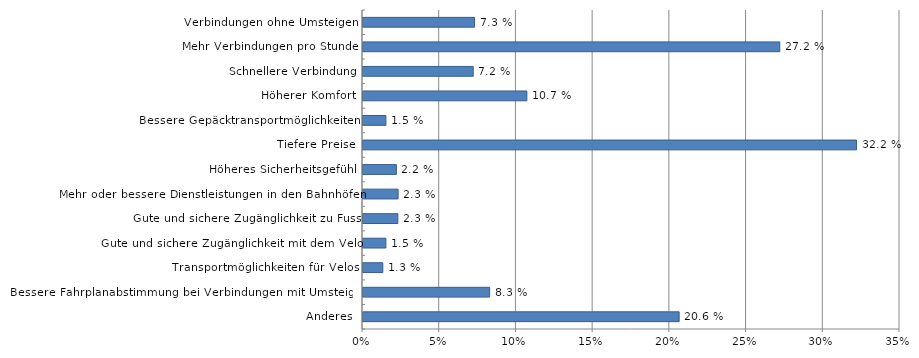
| Category | Ja |
|---|---|
| Verbindungen ohne Umsteigen | 7.269 |
| Mehr Verbindungen pro Stunde | 27.165 |
| Schnellere Verbindung | 7.184 |
| Höherer Komfort | 10.68 |
| Bessere Gepäcktransportmöglichkeiten | 1.494 |
| Tiefere Preise | 32.168 |
| Höheres Sicherheitsgefühl | 2.177 |
| Mehr oder bessere Dienstleistungen in den Bahnhöfen | 2.288 |
| Gute und sichere Zugänglichkeit zu Fuss | 2.273 |
| Gute und sichere Zugänglichkeit mit dem Velo | 1.492 |
| Transportmöglichkeiten für Velos | 1.292 |
| Bessere Fahrplanabstimmung bei Verbindungen mit Umsteigen | 8.253 |
| Anderes | 20.606 |